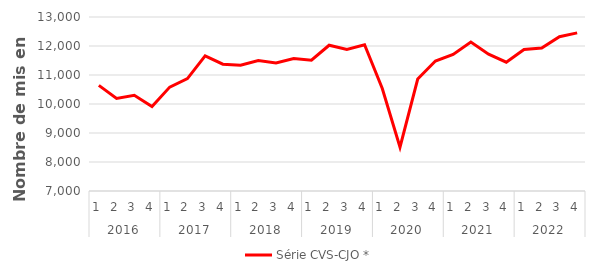
| Category | Série CVS-CJO * |
|---|---|
| 0 | 10642.702 |
| 1 | 10190.258 |
| 2 | 10299.649 |
| 3 | 9913.683 |
| 4 | 10582.585 |
| 5 | 10873.69 |
| 6 | 11658.562 |
| 7 | 11373.503 |
| 8 | 11333.83 |
| 9 | 11501.267 |
| 10 | 11418.248 |
| 11 | 11570.555 |
| 12 | 11508.59 |
| 13 | 12025.703 |
| 14 | 11881.368 |
| 15 | 12042.225 |
| 16 | 10532.959 |
| 17 | 8513.618 |
| 18 | 10859.747 |
| 19 | 11482.614 |
| 20 | 11710.476 |
| 21 | 12136.527 |
| 22 | 11718.972 |
| 23 | 11442.973 |
| 24 | 11878.089 |
| 25 | 11927.239 |
| 26 | 12321.897 |
| 27 | 12451.732 |